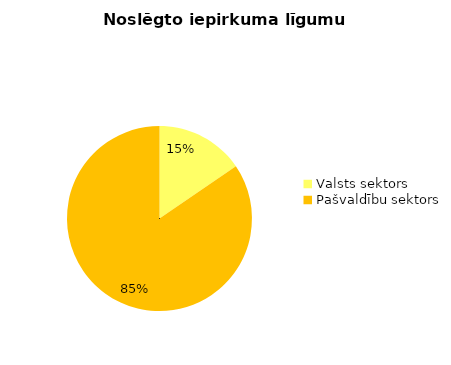
| Category | Noslēgto iepirkuma līgumu skaits |
|---|---|
| Valsts sektors | 15 |
| Pašvaldību sektors | 82 |